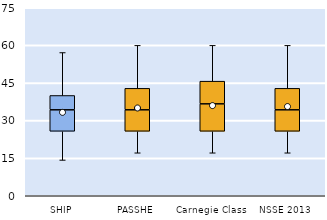
| Category | 25th | 50th | 75th |
|---|---|---|---|
| SHIP | 25.714 | 8.571 | 5.714 |
| PASSHE | 25.714 | 8.571 | 8.571 |
| Carnegie Class | 25.714 | 10.952 | 9.048 |
| NSSE 2013 | 25.714 | 8.571 | 8.571 |